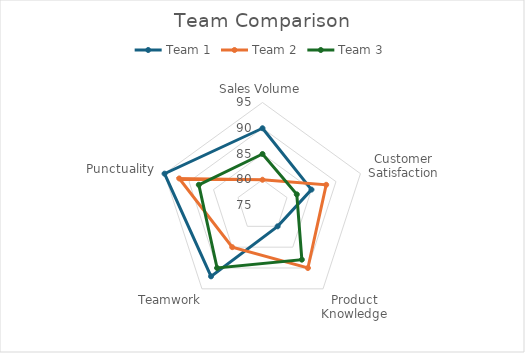
| Category | Team 1 | Team 2 | Team 3 |
|---|---|---|---|
| Sales Volume | 90 | 80 | 85 |
| Customer Satisfaction | 85 | 88 | 82 |
| Product Knowledge | 80 | 90 | 88 |
| Teamwork | 92 | 85 | 90 |
| Punctuality | 95 | 92 | 88 |